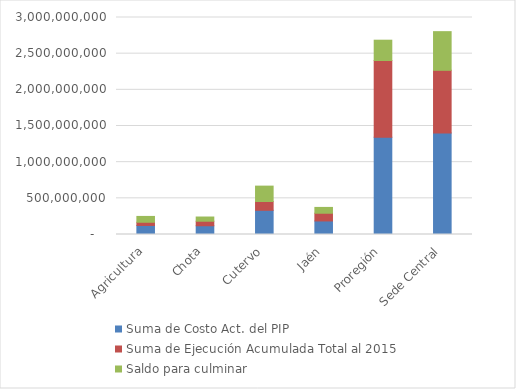
| Category | Suma de Costo Act. del PIP | Suma de Ejecución Acumulada Total al 2015 | Saldo para culminar  |
|---|---|---|---|
| Agricultura | 124935921.61 | 44233907.07 | 80702014.54 |
| Chota | 120864055.55 | 62712491.91 | 58151563.64 |
| Cutervo | 334424861.74 | 121629145.52 | 212795716.22 |
| Jaén | 187205718.59 | 106725613.59 | 80480105 |
| Proregión | 1343095490.72 | 1062502926.29 | 280592564.43 |
| Sede Central | 1402222240.78 | 867532341 | 534689899.78 |